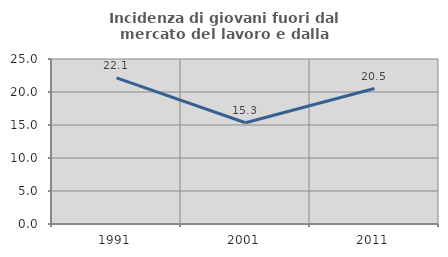
| Category | Incidenza di giovani fuori dal mercato del lavoro e dalla formazione  |
|---|---|
| 1991.0 | 22.136 |
| 2001.0 | 15.337 |
| 2011.0 | 20.524 |